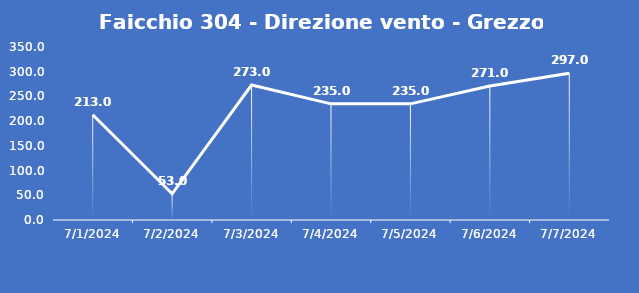
| Category | Faicchio 304 - Direzione vento - Grezzo (°N) |
|---|---|
| 7/1/24 | 213 |
| 7/2/24 | 53 |
| 7/3/24 | 273 |
| 7/4/24 | 235 |
| 7/5/24 | 235 |
| 7/6/24 | 271 |
| 7/7/24 | 297 |